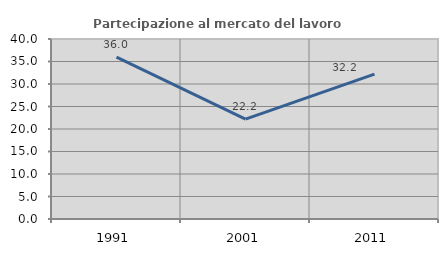
| Category | Partecipazione al mercato del lavoro  femminile |
|---|---|
| 1991.0 | 35.971 |
| 2001.0 | 22.189 |
| 2011.0 | 32.188 |